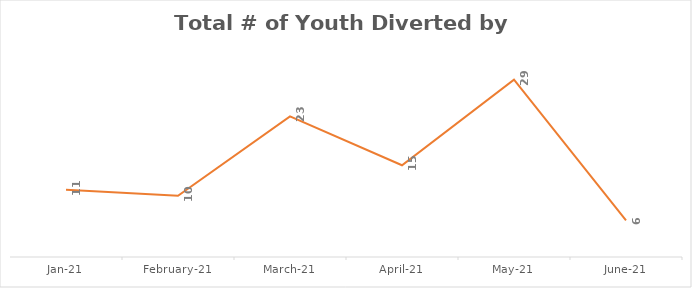
| Category | Series 0 |
|---|---|
| 2021-01-01 | 11 |
| 2021-02-01 | 10 |
| 2021-03-01 | 23 |
| 2021-04-01 | 15 |
| 2021-05-01 | 29 |
| 2021-06-01 | 6 |